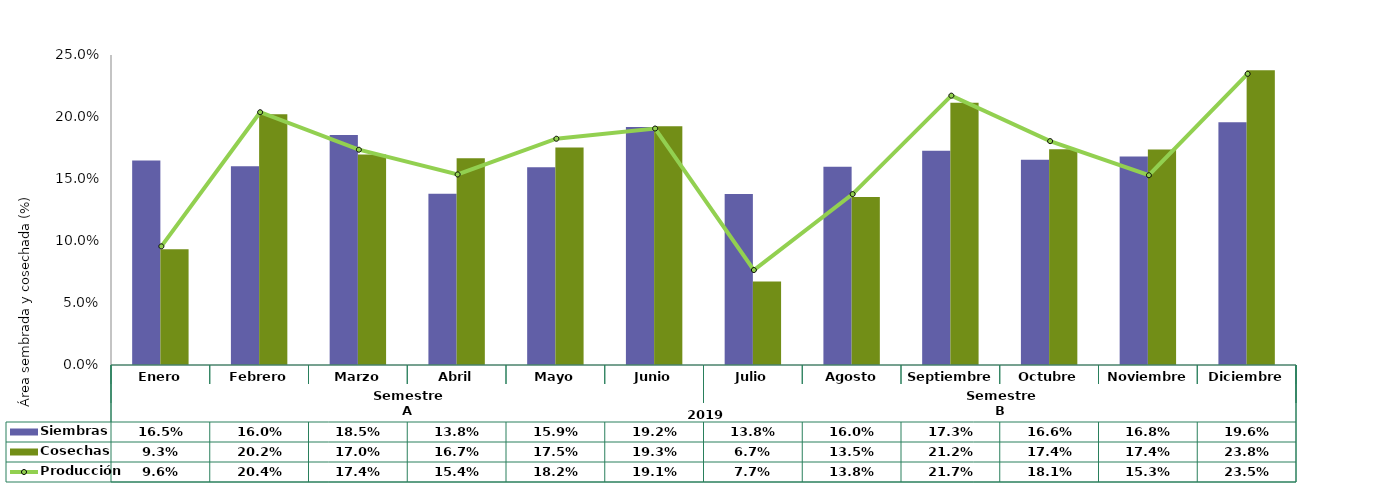
| Category | Siembras | Cosechas   |
|---|---|---|
| 0 | 0.165 | 0.093 |
| 1 | 0.16 | 0.202 |
| 2 | 0.185 | 0.17 |
| 3 | 0.138 | 0.167 |
| 4 | 0.159 | 0.175 |
| 5 | 0.192 | 0.193 |
| 6 | 0.138 | 0.067 |
| 7 | 0.16 | 0.135 |
| 8 | 0.173 | 0.212 |
| 9 | 0.166 | 0.174 |
| 10 | 0.168 | 0.174 |
| 11 | 0.196 | 0.238 |